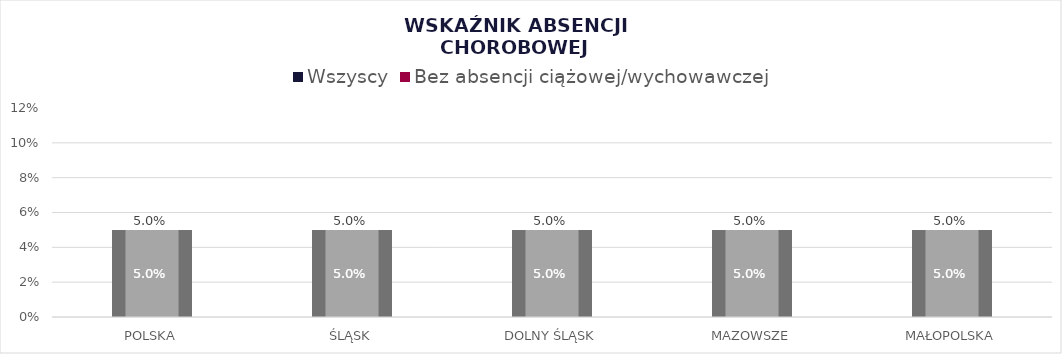
| Category | Wszyscy |
|---|---|
| POLSKA | 0.05 |
| ŚLĄSK | 0.05 |
| DOLNY ŚLĄSK | 0.05 |
| MAZOWSZE | 0.05 |
| MAŁOPOLSKA | 0.05 |